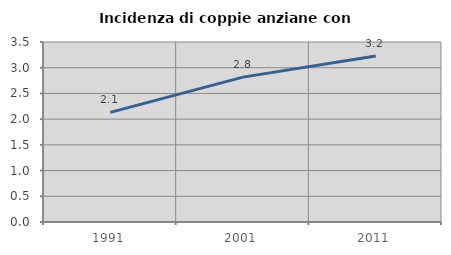
| Category | Incidenza di coppie anziane con figli |
|---|---|
| 1991.0 | 2.132 |
| 2001.0 | 2.817 |
| 2011.0 | 3.226 |